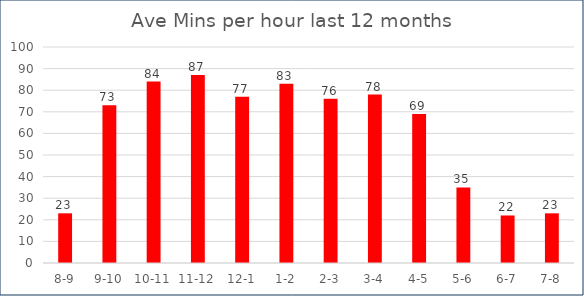
| Category | Ave Mins YTD |
|---|---|
| 8-9 | 23 |
| 9-10 | 73 |
| 10-11 | 84 |
| 11-12 | 87 |
| 12-1 | 77 |
| 1-2 | 83 |
| 2-3 | 76 |
| 3-4 | 78 |
| 4-5 | 69 |
| 5-6 | 35 |
| 6-7 | 22 |
| 7-8 | 23 |